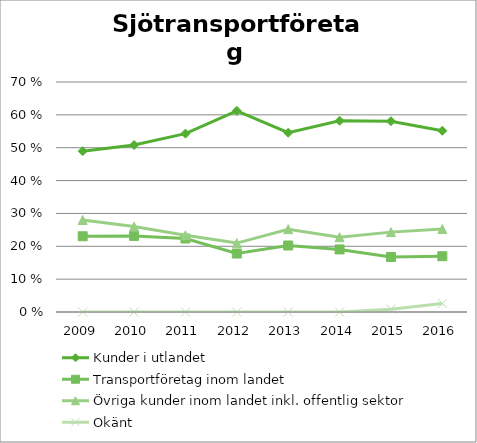
| Category | Kunder i utlandet | Transportföretag inom landet | Övriga kunder inom landet inkl. offentlig sektor | Okänt |
|---|---|---|---|---|
| 2009.0 | 0.49 | 0.23 | 0.28 | 0 |
| 2010.0 | 0.508 | 0.232 | 0.26 | 0 |
| 2011.0 | 0.543 | 0.224 | 0.233 | 0 |
| 2012.0 | 0.612 | 0.178 | 0.21 | 0 |
| 2013.0 | 0.546 | 0.202 | 0.252 | 0 |
| 2014.0 | 0.582 | 0.19 | 0.228 | 0 |
| 2015.0 | 0.581 | 0.167 | 0.243 | 0.009 |
| 2016.0 | 0.552 | 0.17 | 0.253 | 0.026 |